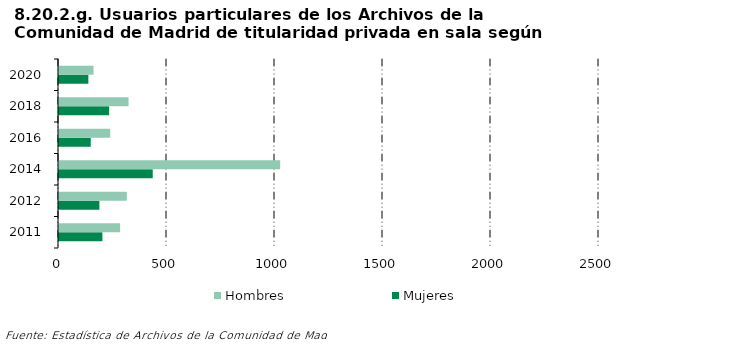
| Category | Mujeres | Hombres |
|---|---|---|
| 2011.0 | 201 | 283 |
| 2012.0 | 187 | 314 |
| 2014.0 | 434 | 1024 |
| 2016.0 | 147 | 237 |
| 2018.0 | 232 | 322 |
| 2020.0 | 136 | 160 |